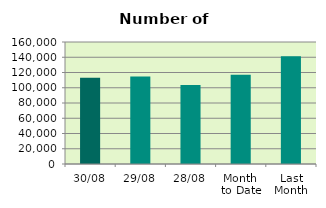
| Category | Series 0 |
|---|---|
| 30/08 | 113030 |
| 29/08 | 114804 |
| 28/08 | 103684 |
| Month 
to Date | 117075.091 |
| Last
Month | 141432.273 |